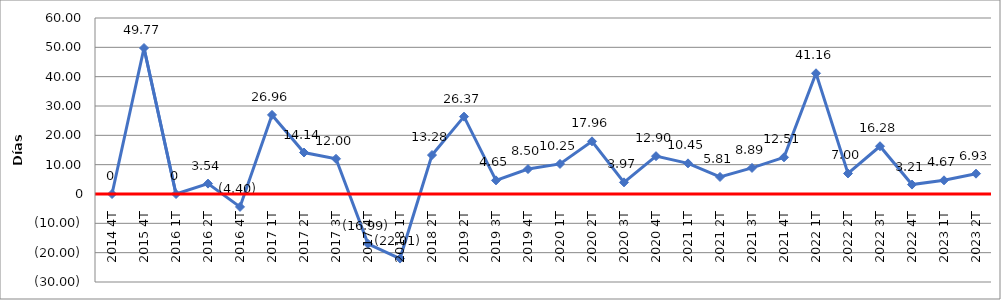
| Category | Series 0 |
|---|---|
| 2014 4T | 0 |
| 2015 4T | 49.77 |
| 2016 1T | 0 |
| 2016 2T | 3.54 |
| 2016 4T | -4.4 |
| 2017 1T | 26.96 |
| 2017 2T | 14.14 |
| 2017 3T | 12 |
| 2017 4T | -16.99 |
| 2018 1T | -22.01 |
| 2018 2T | 13.28 |
| 2019 2T | 26.37 |
| 2019 3T | 4.65 |
| 2019 4T | 8.5 |
| 2020 1T | 10.25 |
| 2020 2T | 17.96 |
| 2020 3T | 3.97 |
| 2020 4T | 12.9 |
| 2021 1T | 10.45 |
| 2021 2T | 5.81 |
| 2021 3T | 8.89 |
| 2021 4T | 12.51 |
| 2022 1T | 41.16 |
| 2022 2T | 7 |
| 2022 3T | 16.28 |
| 2022 4T | 3.21 |
| 2023 1T | 4.67 |
| 2023 2T | 6.93 |